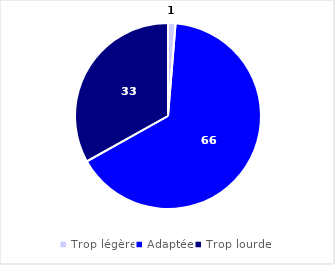
| Category | Series 0 |
|---|---|
| Trop légère | 1.299 |
| Adaptée | 65.585 |
| Trop lourde | 33.117 |